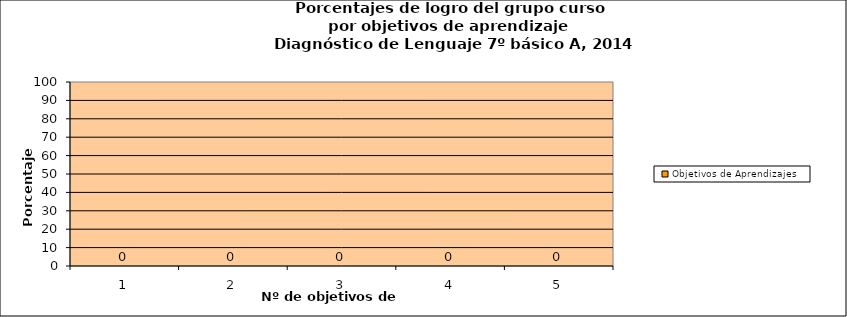
| Category | Objetivos de Aprendizajes |
|---|---|
| 0 | 0 |
| 1 | 0 |
| 2 | 0 |
| 3 | 0 |
| 4 | 0 |